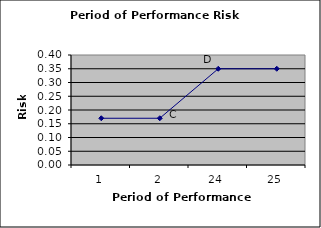
| Category | Risk |
|---|---|
| 1.0 | 0.17 |
| 2.0 | 0.17 |
| 24.0 | 0.35 |
| 25.0 | 0.35 |